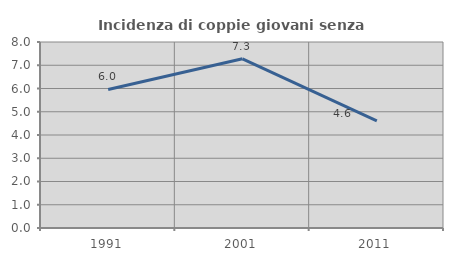
| Category | Incidenza di coppie giovani senza figli |
|---|---|
| 1991.0 | 5.957 |
| 2001.0 | 7.276 |
| 2011.0 | 4.611 |